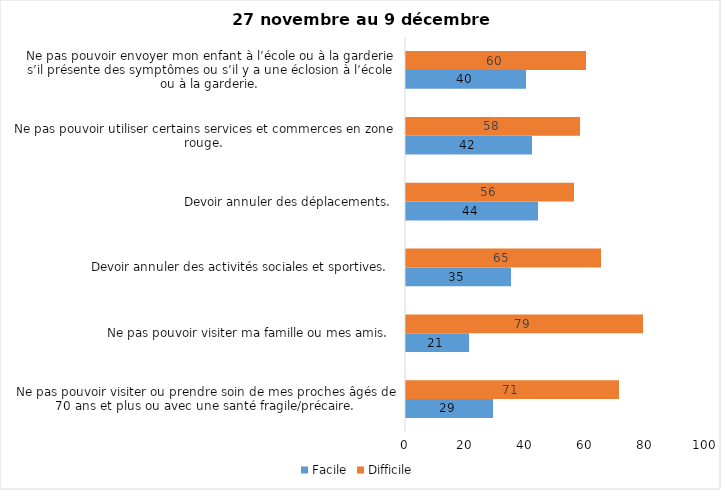
| Category | Facile | Difficile |
|---|---|---|
| Ne pas pouvoir visiter ou prendre soin de mes proches âgés de 70 ans et plus ou avec une santé fragile/précaire.  | 29 | 71 |
| Ne pas pouvoir visiter ma famille ou mes amis.  | 21 | 79 |
| Devoir annuler des activités sociales et sportives.  | 35 | 65 |
| Devoir annuler des déplacements.  | 44 | 56 |
| Ne pas pouvoir utiliser certains services et commerces en zone rouge.  | 42 | 58 |
| Ne pas pouvoir envoyer mon enfant à l’école ou à la garderie s’il présente des symptômes ou s’il y a une éclosion à l’école ou à la garderie.  | 40 | 60 |